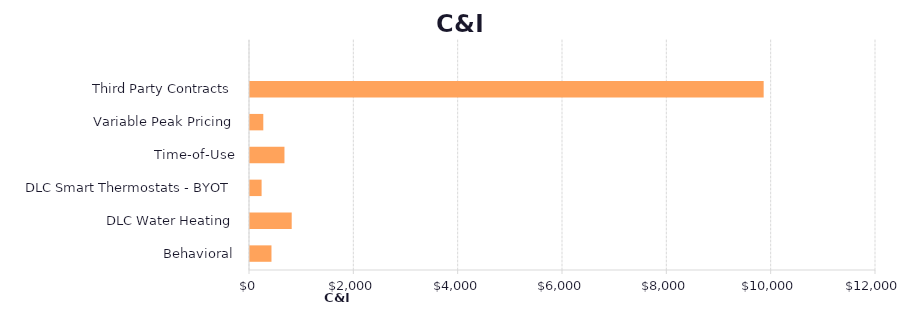
| Category | Series 1 |
|---|---|
| Behavioral | 411.643 |
| DLC Water Heating | 799.442 |
| DLC Smart Thermostats - BYOT | 222.364 |
| Time-of-Use | 660.535 |
| Variable Peak Pricing | 254.885 |
| Third Party Contracts | 9846.575 |